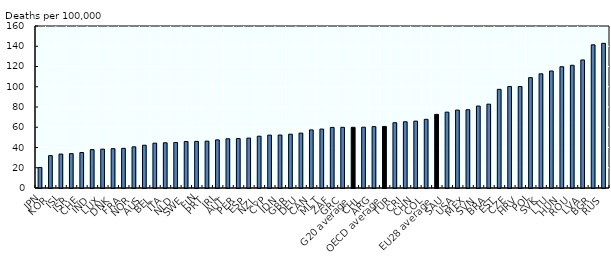
| Category | Series 0 |
|---|---|
| JPN | 20.283 |
| KOR | 31.958 |
| ISL | 33.513 |
| ISR | 33.964 |
| CHE | 35.041 |
| IND | 37.898 |
| LUX | 38.372 |
| DNK | 38.871 |
| FRA | 39.187 |
| NOR | 40.65 |
| AUS | 42.251 |
| BEL | 44.261 |
| ITA | 44.67 |
| NLD | 44.938 |
| SWE | 45.922 |
| FIN | 46.035 |
| PRT | 46.29 |
| IRL | 47.511 |
| AUT | 48.633 |
| PER | 48.819 |
| ESP | 49.276 |
| NZL | 51.157 |
| CYP | 52.212 |
| IDN | 52.315 |
| GBR | 53.134 |
| DEU | 54.224 |
| CAN | 57.366 |
| MLT | 58.193 |
| ZAF | 59.843 |
| GRC | 59.936 |
| G20 average | 59.952 |
| CHL | 60.02 |
| ARG | 60.612 |
| OECD average | 60.787 |
| TUR | 64.471 |
| CRI | 65.415 |
| CHN | 66.047 |
| COL | 67.827 |
| EU28 average | 72.738 |
| SAU | 74.919 |
| USA | 76.958 |
| MEX | 77.273 |
| SVN | 80.937 |
| BRA | 82.806 |
| EST | 97.425 |
| CZE | 100.23 |
| HRV | 100.232 |
| POL | 109.011 |
| SVK | 112.781 |
| LTU | 115.577 |
| HUN | 119.769 |
| ROU | 121.189 |
| LVA | 126.453 |
| BGR | 141.404 |
| RUS | 142.873 |